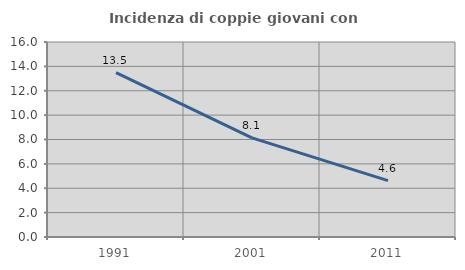
| Category | Incidenza di coppie giovani con figli |
|---|---|
| 1991.0 | 13.49 |
| 2001.0 | 8.133 |
| 2011.0 | 4.631 |